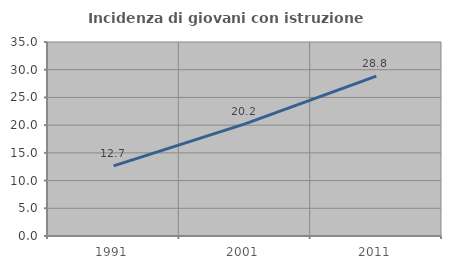
| Category | Incidenza di giovani con istruzione universitaria |
|---|---|
| 1991.0 | 12.659 |
| 2001.0 | 20.223 |
| 2011.0 | 28.843 |